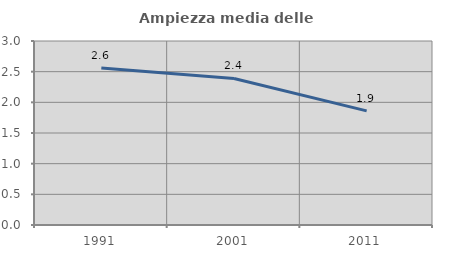
| Category | Ampiezza media delle famiglie |
|---|---|
| 1991.0 | 2.56 |
| 2001.0 | 2.389 |
| 2011.0 | 1.86 |